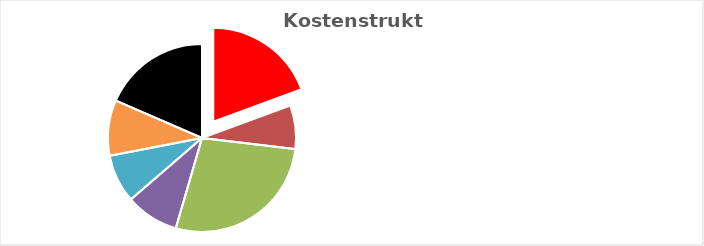
| Category | Series 0 |
|---|---|
| KV-Entgelt produktiv Tätige | 1 |
| Weitere Personalkosten produktiv | 0.388 |
| Personalnebenkosten | 1.426 |
| Unproduktives Personal | 0.473 |
| Deckung Personalgemeinkosten | 0.428 |
| Umlagen ohne GZ | 0.493 |
| Gesamtzuschlag | 0.954 |